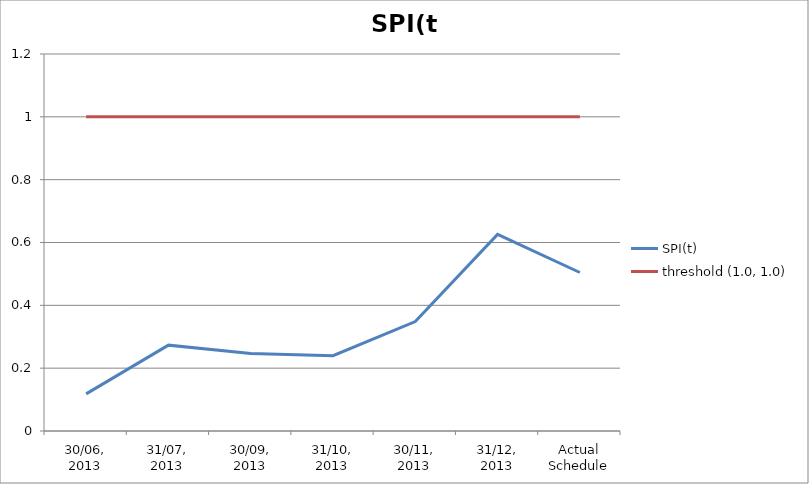
| Category | SPI(t) | threshold (1.0, 1.0) |
|---|---|---|
| 30/06, 2013 | 0.118 | 1 |
| 31/07, 2013 | 0.273 | 1 |
| 30/09, 2013 | 0.247 | 1 |
| 31/10, 2013 | 0.24 | 1 |
| 30/11, 2013 | 0.348 | 1 |
| 31/12, 2013 | 0.626 | 1 |
| Actual Schedule | 0.504 | 1 |